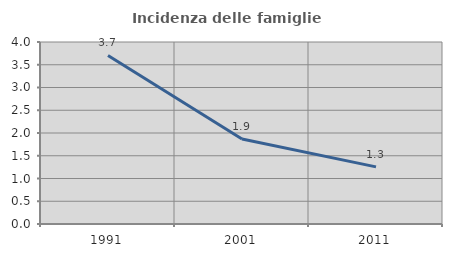
| Category | Incidenza delle famiglie numerose |
|---|---|
| 1991.0 | 3.704 |
| 2001.0 | 1.867 |
| 2011.0 | 1.256 |